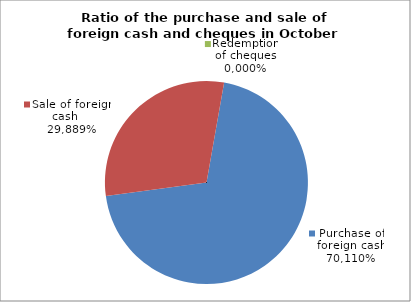
| Category | Purchase of foreign cash |
|---|---|
| 0 | 0.701 |
| 1 | 0.299 |
| 2 | 0 |